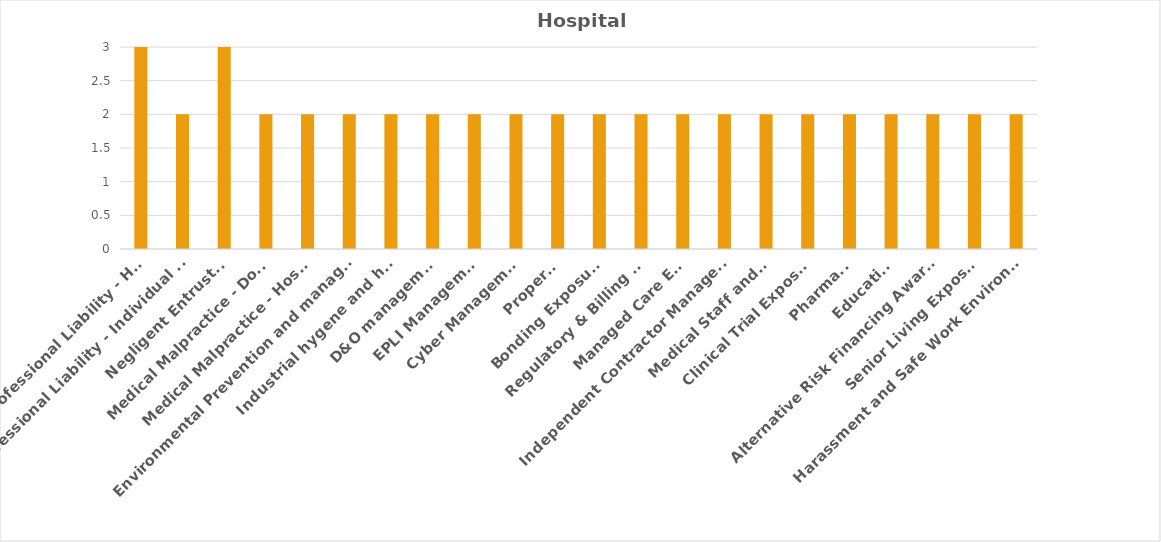
| Category | Series 0 |
|---|---|
| Medical Professional Liability - Hospital | 3 |
| Medical Professional Liability - Individual Physicians and professionals | 2 |
| Negligent Entrustment | 3 |
| Medical Malpractice - Doctor | 2 |
| Medical Malpractice - Hospital | 2 |
| Environmental Prevention and management | 2 |
| Industrial hygene and health | 2 |
| D&O management | 2 |
| EPLI Management | 2 |
| Cyber Management | 2 |
| Property | 2 |
| Bonding Exposures | 2 |
| Regulatory & Billing E&O | 2 |
| Managed Care E&O | 2 |
| Independent Contractor Management | 2 |
| Medical Staff and HR | 2 |
| Clinical Trial Exposure | 2 |
| Pharmacy | 2 |
| Education | 2 |
| Alternative Risk Financing Awareness | 2 |
| Senior Living Exposure | 2 |
| Harassment and Safe Work Environment | 2 |